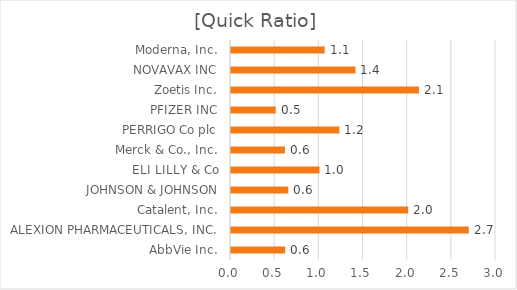
| Category | [Quick Ratio] |
|---|---|
| AbbVie Inc. | 0.613 |
| ALEXION PHARMACEUTICALS, INC. | 2.692 |
| Catalent, Inc. | 2.005 |
| JOHNSON & JOHNSON | 0.649 |
| ELI LILLY & Co | 1.001 |
| Merck & Co., Inc. | 0.611 |
| PERRIGO Co plc | 1.227 |
| PFIZER INC | 0.506 |
| Zoetis Inc. | 2.128 |
| NOVAVAX INC | 1.409 |
| Moderna, Inc. | 1.06 |